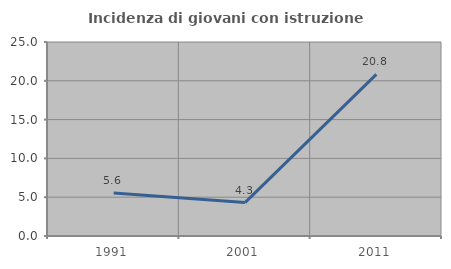
| Category | Incidenza di giovani con istruzione universitaria |
|---|---|
| 1991.0 | 5.556 |
| 2001.0 | 4.31 |
| 2011.0 | 20.833 |